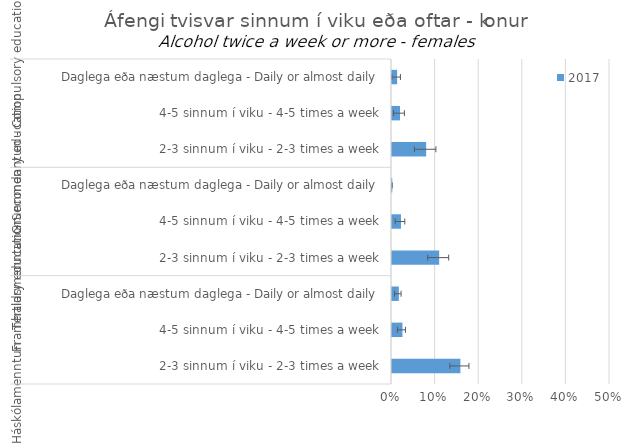
| Category | 2017 |
|---|---|
| 0 | 0.012 |
| 1 | 0.018 |
| 2 | 0.078 |
| 3 | 0.001 |
| 4 | 0.021 |
| 5 | 0.108 |
| 6 | 0.016 |
| 7 | 0.024 |
| 8 | 0.157 |